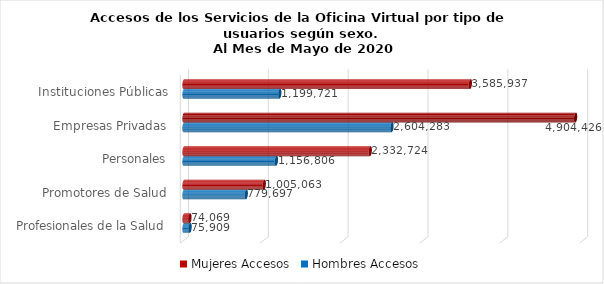
| Category | Mujeres | Hombres |
|---|---|---|
| Instituciones Públicas | 3585937 | 1199721 |
| Empresas Privadas | 4904426 | 2604283 |
| Personales | 2332724 | 1156806 |
| Promotores de Salud | 1005063 | 779697 |
| Profesionales de la Salud | 74069 | 75909 |